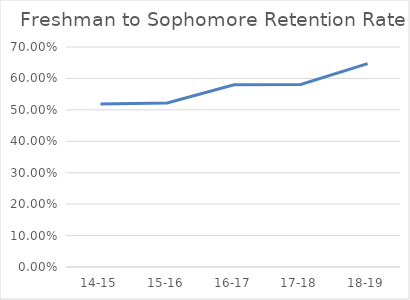
| Category | PERCENT RETENTION |
|---|---|
| 14-15 | 0.519 |
| 15-16 | 0.522 |
| 16-17 | 0.58 |
| 17-18 | 0.581 |
| 18-19 | 0.647 |